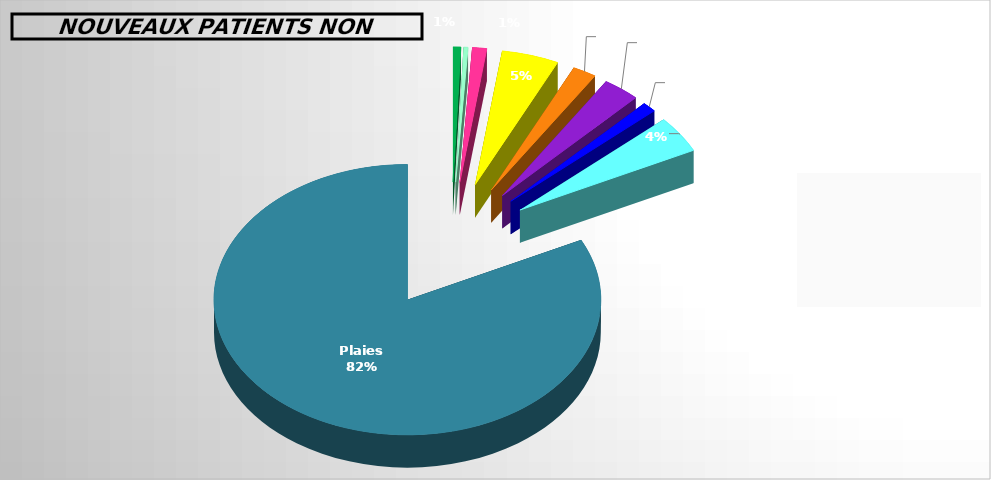
| Category | Series 0 |
|---|---|
| Néo-vessies orthotopiques | 0.007 |
| Néo-vessies hétérotopiques | 0.004 |
| Nephrostomies | 0.012 |
| Incontinences Urinaires | 0.048 |
| Auto-sondages | 0.02 |
| Incontinences Fécales | 0.031 |
| Gastro / Jejunostomies | 0.012 |
| Fistules / Drains | 0.044 |
| Plaies | 0.823 |